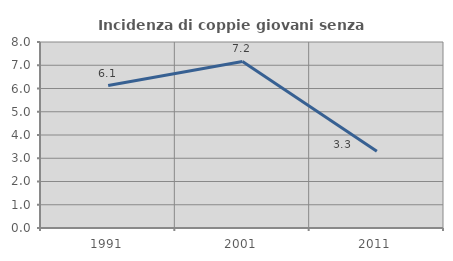
| Category | Incidenza di coppie giovani senza figli |
|---|---|
| 1991.0 | 6.129 |
| 2001.0 | 7.162 |
| 2011.0 | 3.297 |